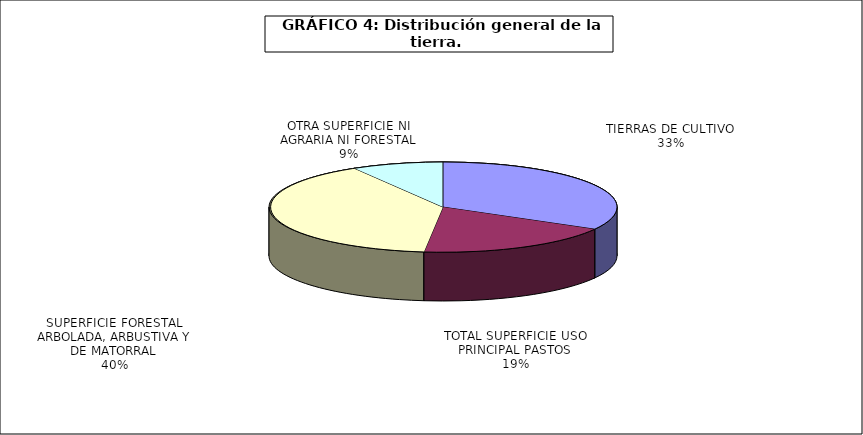
| Category | Series 0 |
|---|---|
| TIERRAS DE CULTIVO | 16770363.89 |
| TOTAL SUPERFICIE USO PRINCIPAL PASTOS | 9412960 |
| SUPERFICIE FORESTAL ARBOLADA, ARBUSTIVA Y DE MATORRAL | 20113052 |
| OTRA SUPERFICIE NI AGRARIA NI FORESTAL | 4302510 |